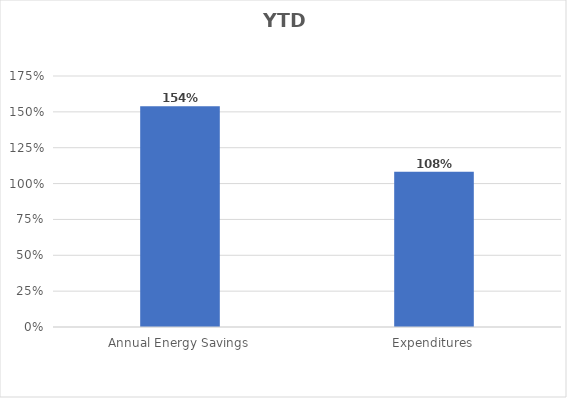
| Category | Series 0 |
|---|---|
| Annual Energy Savings | 1.538 |
| Expenditures | 1.083 |